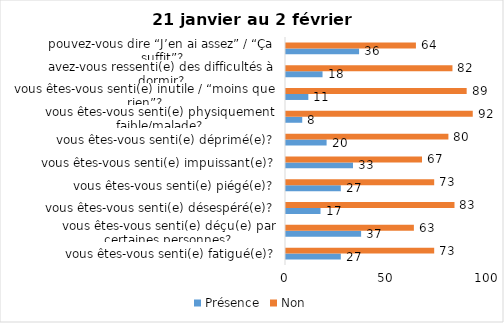
| Category | Présence | Non |
|---|---|---|
| vous êtes-vous senti(e) fatigué(e)? | 27 | 73 |
| vous êtes-vous senti(e) déçu(e) par certaines personnes? | 37 | 63 |
| vous êtes-vous senti(e) désespéré(e)? | 17 | 83 |
| vous êtes-vous senti(e) piégé(e)? | 27 | 73 |
| vous êtes-vous senti(e) impuissant(e)? | 33 | 67 |
| vous êtes-vous senti(e) déprimé(e)? | 20 | 80 |
| vous êtes-vous senti(e) physiquement faible/malade? | 8 | 92 |
| vous êtes-vous senti(e) inutile / “moins que rien”? | 11 | 89 |
| avez-vous ressenti(e) des difficultés à dormir? | 18 | 82 |
| pouvez-vous dire “J’en ai assez” / “Ça suffit”? | 36 | 64 |